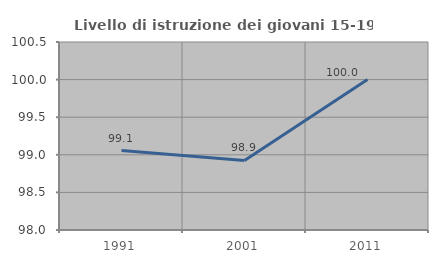
| Category | Livello di istruzione dei giovani 15-19 anni |
|---|---|
| 1991.0 | 99.057 |
| 2001.0 | 98.925 |
| 2011.0 | 100 |